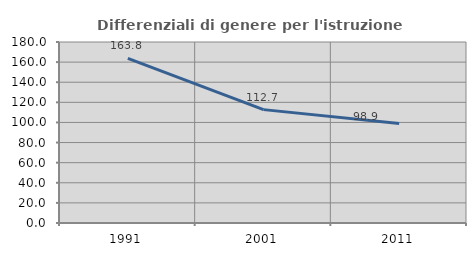
| Category | Differenziali di genere per l'istruzione superiore |
|---|---|
| 1991.0 | 163.763 |
| 2001.0 | 112.743 |
| 2011.0 | 98.88 |